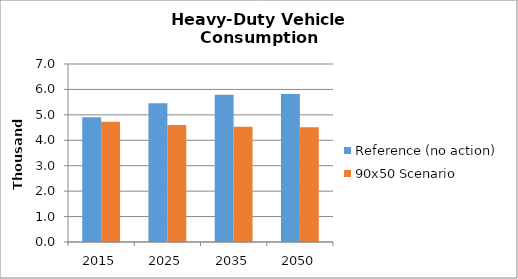
| Category | Reference (no action) | 90x50 Scenario |
|---|---|---|
| 2015.0 | 4.905 | 4.733 |
| 2025.0 | 5.461 | 4.599 |
| 2035.0 | 5.79 | 4.529 |
| 2050.0 | 5.822 | 4.513 |